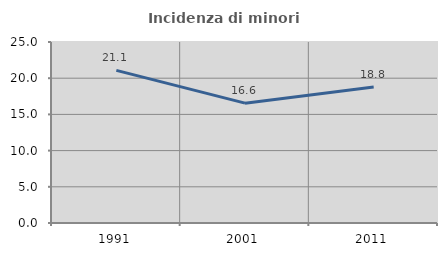
| Category | Incidenza di minori stranieri |
|---|---|
| 1991.0 | 21.078 |
| 2001.0 | 16.552 |
| 2011.0 | 18.769 |